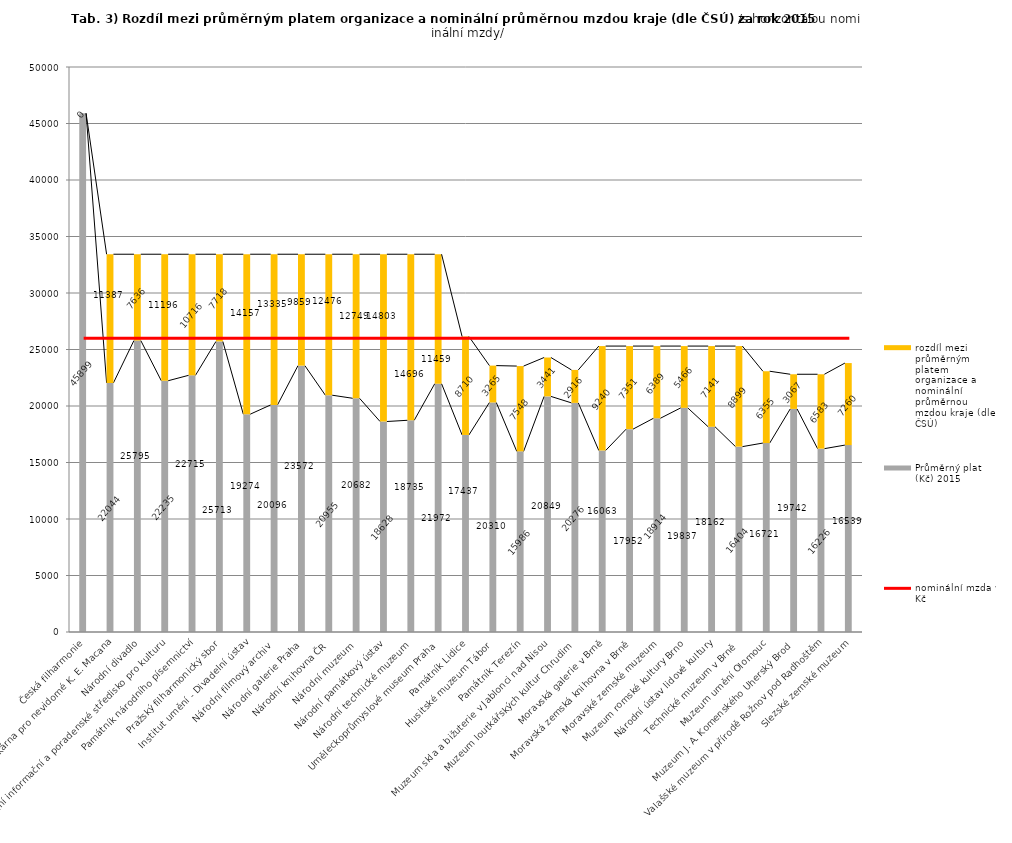
| Category | Průměrný plat (Kč) 2015 | rozdíl mezi průměrným platem organizace a nominální průměrnou mzdou kraje (dle ČSÚ) |
|---|---|---|
| Česká filharmonie | 45899 | 0 |
| Knihovna a tiskárna pro nevidomé K. E. Macana | 22044 | 11387 |
| Národní divadlo | 25795 | 7636 |
| Národní informační a poradenské středisko pro kulturu | 22235 | 11196 |
| Památník národního písemnictví | 22715 | 10716 |
| Pražský filharmonický sbor | 25713 | 7718 |
| Institut umění - Divadelní ústav | 19274 | 14157 |
| Národní filmový archiv | 20096 | 13335 |
| Národní galerie Praha | 23572 | 9859 |
| Národní knihovna ČR | 20955 | 12476 |
| Národní muzeum | 20682 | 12749 |
| Národní památkový ústav | 18628 | 14803 |
| Národní technické muzeum | 18735 | 14696 |
| Uměleckoprůmyslové museum Praha | 21972 | 11459 |
| Památník Lidice | 17437 | 8710 |
| Husitské muzeum Tábor | 20310 | 3265 |
| Památník Terezín | 15986 | 7548 |
| Muzeum skla a bižuterie v Jablonci nad Nisou | 20849 | 3441 |
| Muzeum loutkářských kultur Chrudim | 20276 | 2916 |
| Moravská galerie v Brně | 16063 | 9240 |
| Moravská zemská knihovna v Brně | 17952 | 7351 |
| Moravské zemské muzeum | 18914 | 6389 |
| Muzeum romské kultury Brno | 19837 | 5466 |
| Národní ústav lidové kultury | 18162 | 7141 |
| Technické muzeum v Brně  | 16404 | 8899 |
| Muzeum umění Olomouc | 16721 | 6355 |
| Muzeum J. A. Komenského Uherský Brod | 19742 | 3067 |
| Valašské muzeum v přírodě Rožnov pod Radhoštěm | 16226 | 6583 |
| Slezské zemské muzeum | 16539 | 7260 |